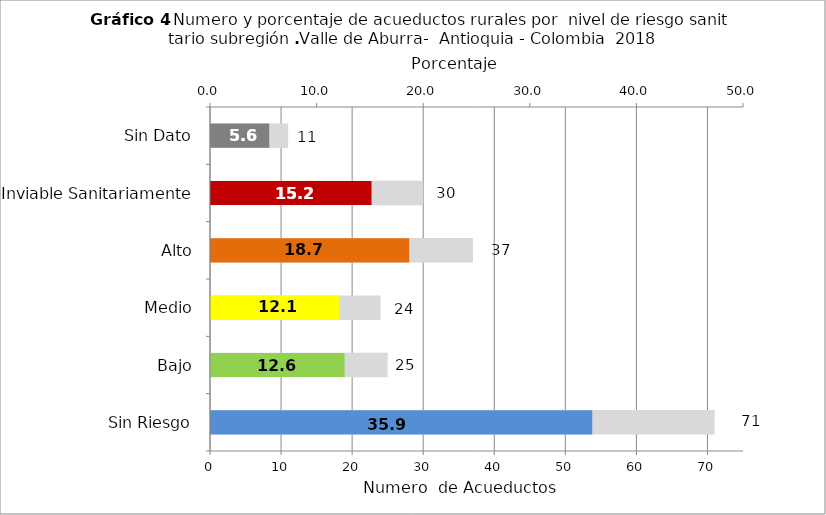
| Category | Número de Sistemas |
|---|---|
| Sin Riesgo | 71 |
| Bajo | 25 |
| Medio | 24 |
| Alto | 37 |
| Inviable Sanitariamente | 30 |
| Sin Dato | 11 |